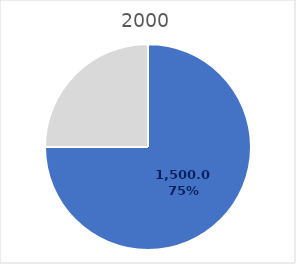
| Category | Series 0 |
|---|---|
| 0 | 1500 |
| 1 | 500 |